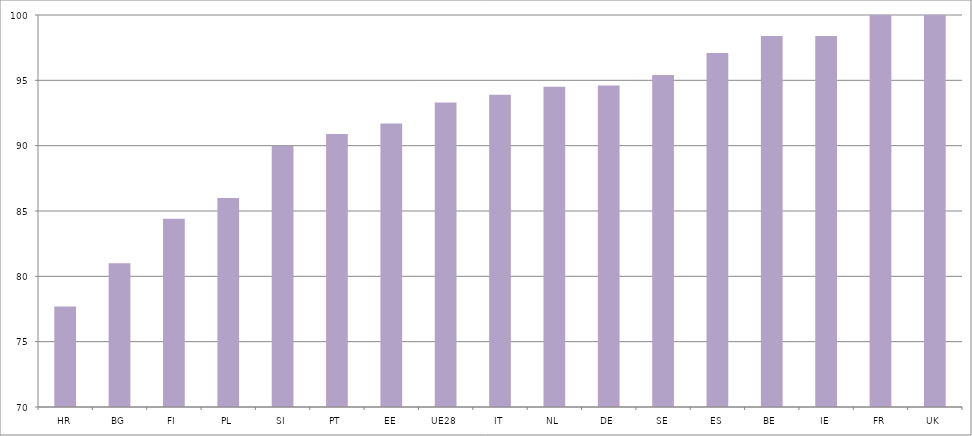
| Category | 2017 |
|---|---|
| HR | 77.7 |
| BG | 81 |
| FI | 84.4 |
| PL | 86 |
| SI | 90 |
| PT | 90.9 |
| EE | 91.7 |
| UE28 | 93.3 |
| IT | 93.9 |
| NL | 94.5 |
| DE | 94.6 |
| SE | 95.4 |
| ES | 97.1 |
| BE | 98.4 |
| IE | 98.4 |
| FR | 100 |
| UK | 100 |